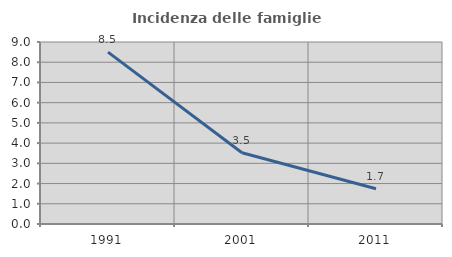
| Category | Incidenza delle famiglie numerose |
|---|---|
| 1991.0 | 8.502 |
| 2001.0 | 3.523 |
| 2011.0 | 1.746 |